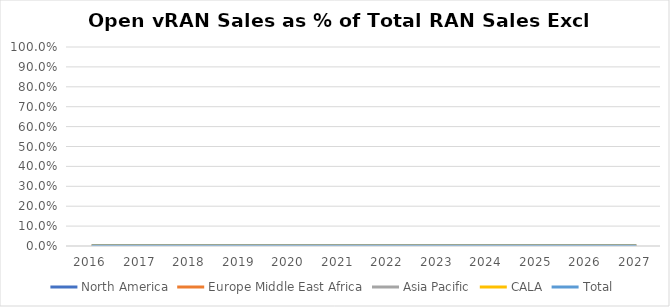
| Category | North America | Europe Middle East Africa | Asia Pacific | CALA | Total |
|---|---|---|---|---|---|
| 2016.0 | 0 | 0 | 0 | 0 | 0 |
| 2017.0 | 0 | 0 | 0 | 0 | 0 |
| 2018.0 | 0 | 0 | 0 | 0 | 0 |
| 2019.0 | 0 | 0 | 0 | 0 | 0 |
| 2020.0 | 0 | 0 | 0 | 0 | 0 |
| 2021.0 | 0 | 0 | 0 | 0 | 0 |
| 2022.0 | 0 | 0 | 0 | 0 | 0 |
| 2023.0 | 0 | 0 | 0 | 0 | 0 |
| 2024.0 | 0 | 0 | 0 | 0 | 0 |
| 2025.0 | 0 | 0 | 0 | 0 | 0 |
| 2026.0 | 0 | 0 | 0 | 0 | 0 |
| 2027.0 | 0 | 0 | 0 | 0 | 0 |